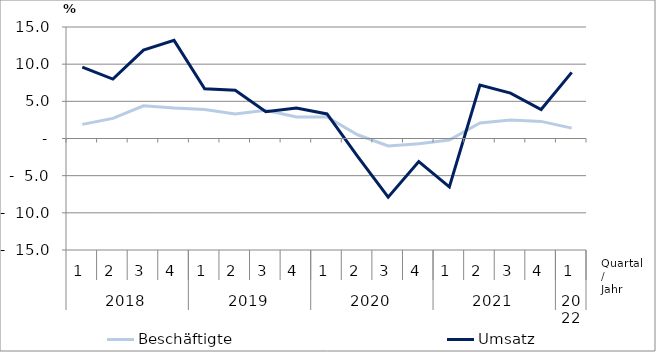
| Category | Beschäftigte | Umsatz |
|---|---|---|
| 0 | 1.9 | 9.6 |
| 1 | 2.7 | 8 |
| 2 | 4.4 | 11.9 |
| 3 | 4.1 | 13.2 |
| 4 | 3.9 | 6.7 |
| 5 | 3.3 | 6.5 |
| 6 | 3.8 | 3.6 |
| 7 | 2.9 | 4.1 |
| 8 | 2.9 | 3.3 |
| 9 | 0.5 | -2.4 |
| 10 | -1 | -7.9 |
| 11 | -0.7 | -3.1 |
| 12 | -0.2 | -6.5 |
| 13 | 2.1 | 7.2 |
| 14 | 2.5 | 6.1 |
| 15 | 2.3 | 3.9 |
| 16 | 1.4 | 8.9 |